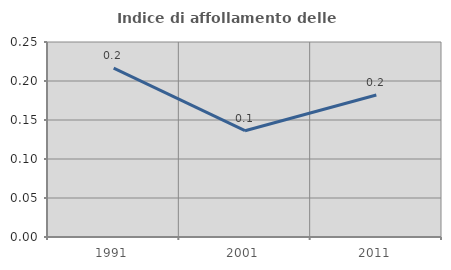
| Category | Indice di affollamento delle abitazioni  |
|---|---|
| 1991.0 | 0.216 |
| 2001.0 | 0.136 |
| 2011.0 | 0.182 |